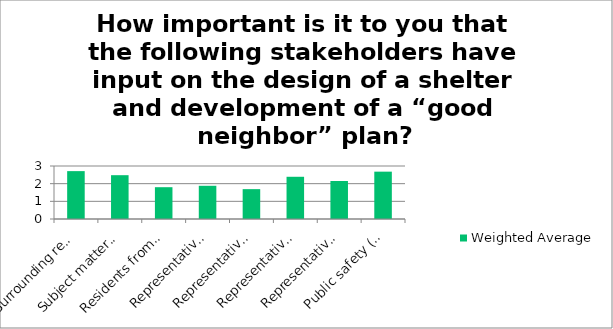
| Category | Weighted Average |
|---|---|
| Surrounding residential neighbors | 2.71 |
| Subject matter experts on shelter/human services | 2.48 |
| Residents from other parts of Bellevue | 1.8 |
| Representatives from Eastside cities | 1.88 |
| Representatives from faith communities | 1.69 |
| Representatives from surrounding businesses | 2.39 |
| Representatives that are currently clients of homeless shelters or services | 2.15 |
| Public safety (Police/Fire/EMT/Park Ranger) staff | 2.68 |